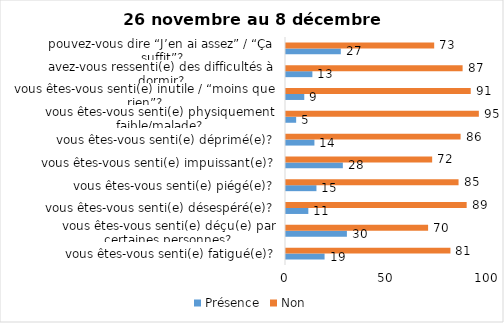
| Category | Présence | Non |
|---|---|---|
| vous êtes-vous senti(e) fatigué(e)? | 19 | 81 |
| vous êtes-vous senti(e) déçu(e) par certaines personnes? | 30 | 70 |
| vous êtes-vous senti(e) désespéré(e)? | 11 | 89 |
| vous êtes-vous senti(e) piégé(e)? | 15 | 85 |
| vous êtes-vous senti(e) impuissant(e)? | 28 | 72 |
| vous êtes-vous senti(e) déprimé(e)? | 14 | 86 |
| vous êtes-vous senti(e) physiquement faible/malade? | 5 | 95 |
| vous êtes-vous senti(e) inutile / “moins que rien”? | 9 | 91 |
| avez-vous ressenti(e) des difficultés à dormir? | 13 | 87 |
| pouvez-vous dire “J’en ai assez” / “Ça suffit”? | 27 | 73 |